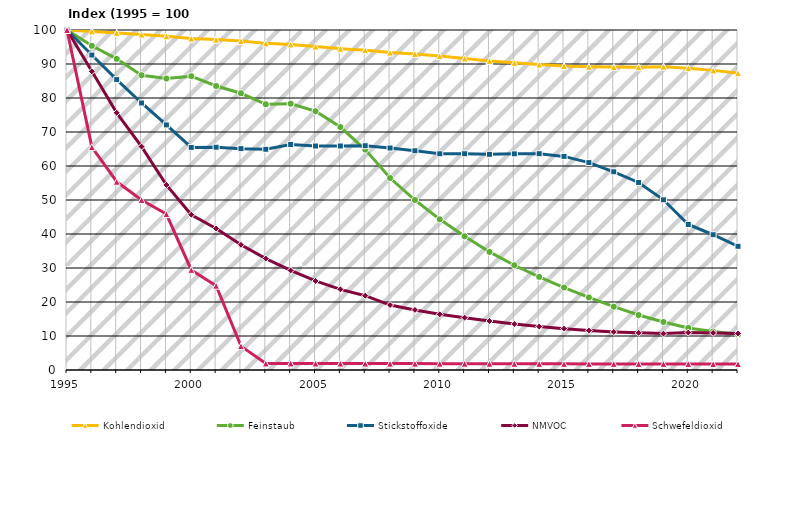
| Category | Kohlendioxid | Feinstaub | Stickstoffoxide | NMVOC | Schwefeldioxid |
|---|---|---|---|---|---|
| 1995.0 | 100 | 100 | 100 | 100 | 100 |
| nan | 99.593 | 95.348 | 92.633 | 87.847 | 65.541 |
| nan | 99.153 | 91.509 | 85.412 | 75.648 | 55.378 |
| nan | 98.664 | 86.695 | 78.537 | 65.715 | 50 |
| nan | 98.137 | 85.721 | 72.083 | 54.424 | 45.863 |
| 2000.0 | 97.474 | 86.412 | 65.465 | 45.668 | 29.442 |
| nan | 97.176 | 83.532 | 65.527 | 41.607 | 24.793 |
| nan | 96.746 | 81.395 | 65.108 | 36.812 | 7.023 |
| nan | 96.068 | 78.158 | 64.919 | 32.773 | 1.932 |
| nan | 95.747 | 78.331 | 66.32 | 29.279 | 1.926 |
| 2005.0 | 95.117 | 76.105 | 65.875 | 26.189 | 1.916 |
| nan | 94.516 | 71.459 | 65.889 | 23.726 | 1.904 |
| nan | 94.041 | 64.833 | 65.968 | 21.855 | 1.895 |
| nan | 93.357 | 56.456 | 65.29 | 19.107 | 1.882 |
| nan | 92.958 | 49.998 | 64.476 | 17.67 | 1.875 |
| 2010.0 | 92.334 | 44.313 | 63.596 | 16.377 | 1.863 |
| nan | 91.625 | 39.32 | 63.609 | 15.392 | 1.849 |
| nan | 90.913 | 34.731 | 63.439 | 14.394 | 1.834 |
| nan | 90.334 | 30.813 | 63.574 | 13.525 | 1.822 |
| nan | 89.84 | 27.38 | 63.614 | 12.78 | 1.811 |
| 2015.0 | 89.42 | 24.259 | 62.82 | 12.152 | 1.802 |
| nan | 89.193 | 21.339 | 61.008 | 11.608 | 1.797 |
| nan | 89.111 | 18.618 | 58.296 | 11.204 | 1.794 |
| nan | 89.049 | 16.166 | 55.149 | 10.932 | 1.793 |
| nan | 89.19 | 14.128 | 50.057 | 10.7 | 1.795 |
| 2020.0 | 88.776 | 12.364 | 42.807 | 11.012 | 1.789 |
| nan | 88.125 | 11.312 | 39.782 | 10.904 | 1.775 |
| nan | 87.295 | 10.527 | 36.381 | 10.738 | 1.758 |